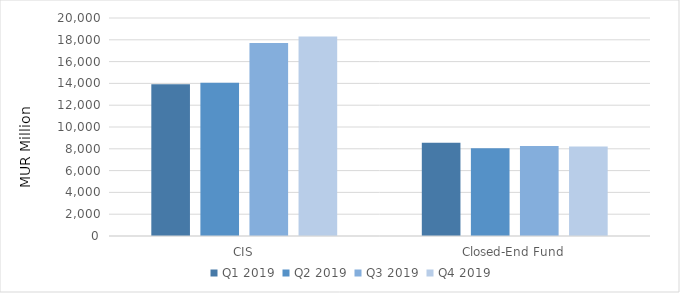
| Category | Q1 2019 | Q2 2019 | Q3 2019 | Q4 2019 |
|---|---|---|---|---|
| CIS | 13910.627 | 14067.769 | 17714.094 | 18291.94 |
| Closed-End Fund | 8550.766 | 8039.553 | 8249.084 | 8218.383 |